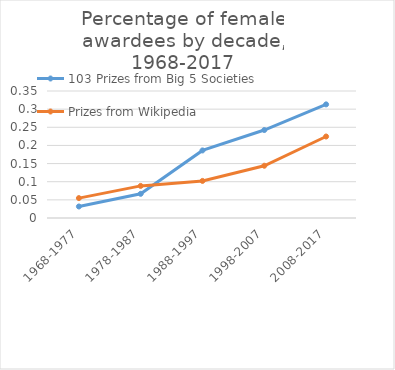
| Category | 103 Prizes from Big 5 Societies | Prizes from Wikipedia |
|---|---|---|
| 1968-1977 | 0.032 | 0.055 |
| 1978-1987 | 0.067 | 0.088 |
| 1988-1997 | 0.186 | 0.102 |
| 1998-2007 | 0.242 | 0.144 |
| 2008-2017 | 0.313 | 0.225 |